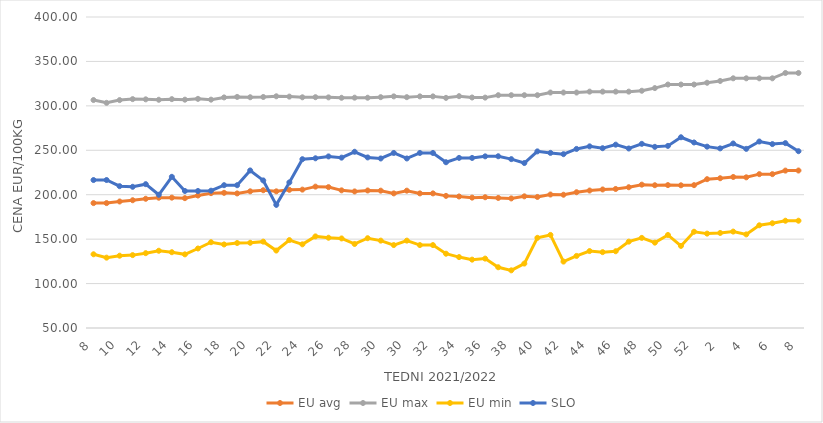
| Category | EU avg | EU max | EU min | SLO |
|---|---|---|---|---|
| 8.0 | 190.57 | 306.55 | 132.97 | 216.51 |
| 9.0 | 190.562 | 303.4 | 129.173 | 216.54 |
| 10.0 | 192.373 | 306.48 | 131.374 | 209.61 |
| 11.0 | 193.79 | 307.58 | 132.024 | 208.91 |
| 12.0 | 195.449 | 307.33 | 134.212 | 211.87 |
| 13.0 | 196.631 | 306.85 | 136.936 | 199.93 |
| 14.0 | 196.702 | 307.56 | 135.297 | 220.15 |
| 15.0 | 196.13 | 306.96 | 132.893 | 204.2 |
| 16.0 | 199.1 | 307.87 | 139.462 | 204.2 |
| 17.0 | 201.754 | 306.98 | 146.538 | 204.51 |
| 18.0 | 202.13 | 309.49 | 144.017 | 210.72 |
| 19.0 | 201.439 | 310.06 | 145.644 | 210.68 |
| 20.0 | 203.834 | 309.69 | 145.911 | 227.32 |
| 21.0 | 205.04 | 309.99 | 147.188 | 216.08 |
| 22.0 | 203.79 | 310.76 | 137.177 | 188.6 |
| 23.0 | 205.51 | 310.41 | 148.928 | 213.84 |
| 24.0 | 205.73 | 309.64 | 144.161 | 239.99 |
| 25.0 | 209.095 | 309.74 | 153.081 | 240.99 |
| 26.0 | 208.551 | 309.55 | 151.599 | 243.11 |
| 27.0 | 204.914 | 309.08 | 150.789 | 241.72 |
| 28.0 | 203.681 | 309.21 | 144.56 | 248.33 |
| 29.0 | 204.773 | 309.15 | 151.052 | 241.96 |
| 30.0 | 204.558 | 309.78 | 148.33 | 240.79 |
| 31.0 | 201.483 | 310.67 | 143.33 | 247 |
| 30.0 | 204.558 | 309.78 | 148.33 | 240.79 |
| 31.0 | 201.483 | 310.67 | 143.33 | 247 |
| 32.0 | 201.483 | 310.67 | 143.33 | 247 |
| 33.0 | 198.691 | 309 | 133.607 | 236.54 |
| 34.0 | 198.027 | 310.9 | 129.797 | 241.45 |
| 35.0 | 196.72 | 309.41 | 126.926 | 241.39 |
| 36.0 | 197.157 | 309.28 | 128.099 | 243.19 |
| 37.0 | 196.375 | 312 | 118.364 | 243.28 |
| 38.0 | 195.821 | 312 | 114.892 | 240.06 |
| 39.0 | 198.179 | 312 | 122.517 | 235.66 |
| 40.0 | 197.482 | 312 | 151.488 | 248.77 |
| 41.0 | 200.22 | 315 | 154.74 | 247.07 |
| 42.0 | 199.965 | 315 | 124.748 | 245.64 |
| 43.0 | 202.804 | 315 | 131.104 | 251.53 |
| 44.0 | 204.713 | 316 | 136.6 | 254.42 |
| 45.0 | 205.906 | 316 | 135.362 | 252.35 |
| 46.0 | 206.476 | 316 | 136.39 | 256.33 |
| 47.0 | 208.415 | 316 | 147.192 | 252.01 |
| 48.0 | 211.314 | 317 | 151.41 | 257.25 |
| 49.0 | 210.677 | 320 | 146.064 | 253.87 |
| 50.0 | 210.823 | 324 | 154.698 | 254.94 |
| 51.0 | 210.59 | 324 | 142.382 | 264.65 |
| 52.0 | 210.763 | 324 | 158.333 | 258.8 |
| 1.0 | 217.49 | 326 | 156.222 | 254.09 |
| 2.0 | 218.55 | 328 | 156.969 | 252.15 |
| 3.0 | 219.967 | 331 | 158.511 | 257.65 |
| 4.0 | 219.57 | 331 | 155.346 | 251.6 |
| 5.0 | 223.136 | 331 | 165.59 | 259.87 |
| 6.0 | 223.143 | 331 | 167.86 | 256.97 |
| 7.0 | 227.138 | 337 | 170.719 | 258.07 |
| 8.0 | 227.232 | 337 | 170.743 | 248.97 |